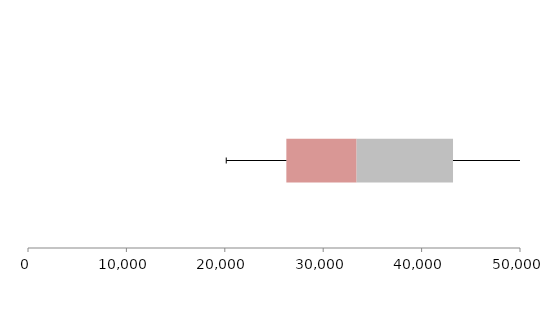
| Category | Series 1 | Series 2 | Series 3 |
|---|---|---|---|
| 0 | 26255.064 | 7141.233 | 9796.098 |